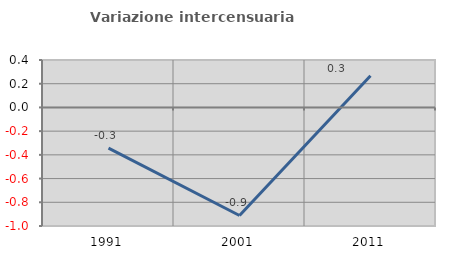
| Category | Variazione intercensuaria annua |
|---|---|
| 1991.0 | -0.343 |
| 2001.0 | -0.911 |
| 2011.0 | 0.268 |